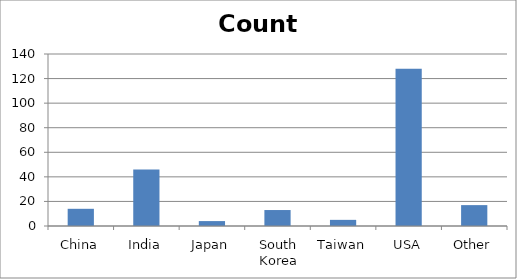
| Category | Count |
|---|---|
| China | 14 |
| India | 46 |
| Japan | 4 |
| South Korea | 13 |
| Taiwan | 5 |
| USA | 128 |
| Other | 17 |